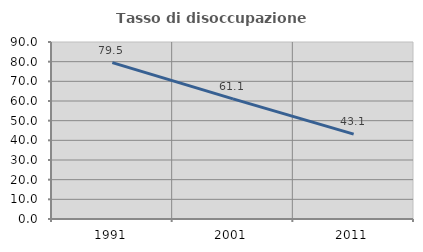
| Category | Tasso di disoccupazione giovanile  |
|---|---|
| 1991.0 | 79.532 |
| 2001.0 | 61.111 |
| 2011.0 | 43.137 |